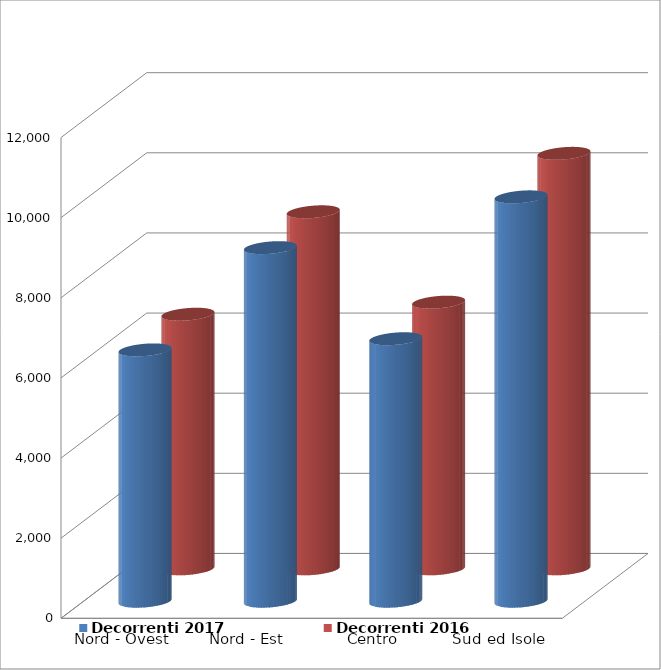
| Category | Decorrenti 2017 | Decorrenti 2016 |
|---|---|---|
| Nord - Ovest | 6273 | 6354 |
| Nord - Est | 8825 | 8910 |
| Centro | 6552 | 6655 |
| Sud ed Isole | 10093 | 10369 |